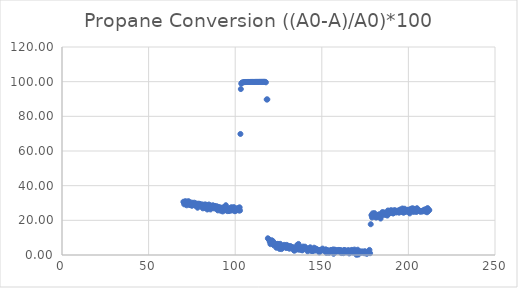
| Category | Propane Conversion |
|---|---|
| 70.10443 | 30.726 |
| 70.33783 | 30.317 |
| 70.57143 | 29.229 |
| 70.80475 | 29.984 |
| 71.03842 | 30.867 |
| 71.2719 | 30.944 |
| 71.50573 | 30.701 |
| 71.73882 | 30.279 |
| 71.97232 | 28.666 |
| 72.20607 | 30.048 |
| 72.43897 | 30.829 |
| 72.67272 | 30.611 |
| 72.90613 | 29.728 |
| 73.13953 | 31.008 |
| 73.37282 | 28.973 |
| 73.60572 | 29.869 |
| 73.83852 | 29.293 |
| 74.07172 | 28.82 |
| 74.30515 | 28.858 |
| 74.5381 | 29.383 |
| 74.77153 | 30.253 |
| 75.00547 | 28.385 |
| 75.23915 | 29.588 |
| 75.47242 | 28.896 |
| 75.70617 | 29.805 |
| 75.93913 | 29.447 |
| 76.17287 | 28.781 |
| 76.40602 | 30.189 |
| 76.63975 | 29.216 |
| 76.8728 | 28.653 |
| 77.10597 | 28.41 |
| 77.3393 | 28.845 |
| 77.57272 | 29.728 |
| 77.8061 | 28.346 |
| 78.04023 | 28.576 |
| 78.27362 | 27.271 |
| 78.507 | 29.05 |
| 78.74085 | 29.268 |
| 78.97373 | 29.613 |
| 79.2068 | 29.024 |
| 79.44078 | 28.896 |
| 79.67463 | 29.421 |
| 79.90855 | 28.794 |
| 80.14255 | 28.487 |
| 80.37617 | 28.372 |
| 80.60932 | 29.178 |
| 80.84238 | 27.834 |
| 81.07563 | 28.935 |
| 81.30957 | 26.926 |
| 81.54335 | 28.96 |
| 81.77735 | 27.348 |
| 82.01055 | 28.346 |
| 82.24422 | 27.553 |
| 82.47763 | 29.178 |
| 82.71093 | 27.028 |
| 82.9445 | 28.845 |
| 83.17827 | 29.024 |
| 83.41153 | 27.297 |
| 83.64458 | 27.399 |
| 83.87808 | 26.247 |
| 84.1111 | 27.502 |
| 84.3442 | 28.129 |
| 84.57725 | 27.476 |
| 84.81073 | 29.14 |
| 85.04437 | 28.487 |
| 85.27747 | 27.681 |
| 85.51065 | 28.218 |
| 85.74392 | 26.286 |
| 85.97798 | 28.487 |
| 86.21107 | 27.86 |
| 86.44472 | 27.22 |
| 86.67822 | 27.565 |
| 86.9118 | 27.847 |
| 87.14508 | 28.692 |
| 87.37818 | 28.116 |
| 87.6117 | 26.938 |
| 87.84517 | 28.103 |
| 88.07858 | 27.425 |
| 88.3121 | 28.321 |
| 88.54512 | 27.553 |
| 88.778 | 26.759 |
| 89.01232 | 27.425 |
| 89.24553 | 26.836 |
| 89.47897 | 28.103 |
| 89.71218 | 26.593 |
| 89.94548 | 25.723 |
| 90.17872 | 26.67 |
| 90.41182 | 27.54 |
| 90.6451 | 27.271 |
| 90.87867 | 27.591 |
| 91.11188 | 27.015 |
| 91.34527 | 26.926 |
| 91.57917 | 25.531 |
| 91.81258 | 26.337 |
| 92.0462 | 27.284 |
| 92.2795 | 27.028 |
| 92.51292 | 26.35 |
| 92.74605 | 25.121 |
| 92.97985 | 27.028 |
| 93.2133 | 27.297 |
| 93.44665 | 27.604 |
| 93.67993 | 25.646 |
| 93.91373 | 27.002 |
| 94.14687 | 26.452 |
| 94.38032 | 26.158 |
| 94.61382 | 28.717 |
| 94.84725 | 26.503 |
| 95.08082 | 25.787 |
| 95.31465 | 26.926 |
| 95.548 | 25.313 |
| 95.78165 | 26.273 |
| 96.01513 | 25.851 |
| 96.24843 | 26.874 |
| 96.48158 | 25.326 |
| 96.71508 | 26.759 |
| 96.94897 | 26.286 |
| 97.18222 | 25.659 |
| 97.41588 | 27.079 |
| 97.6493 | 26.465 |
| 97.88222 | 27.591 |
| 98.11532 | 25.697 |
| 98.34928 | 26.593 |
| 98.58245 | 27.079 |
| 98.8167 | 26.593 |
| 99.05005 | 25.953 |
| 99.28375 | 27.604 |
| 99.51673 | 26.606 |
| 99.75008 | 25.262 |
| 99.98415 | 26.721 |
| 100.21767 | 25.467 |
| 100.45092 | 25.851 |
| 100.68392 | 26.247 |
| 100.9175 | 26.772 |
| 101.15068 | 26.874 |
| 101.3838 | 26.311 |
| 101.61713 | 26.183 |
| 101.85043 | 26.887 |
| 102.08377 | 25.633 |
| 102.31717 | 27.233 |
| 102.55055 | 27.502 |
| 102.78502 | 25.646 |
| 103.01818 | 69.823 |
| 103.25142 | 95.726 |
| 103.49983 | 98.842 |
| 103.79445 | 99.358 |
| 104.22358 | 99.561 |
| 104.69098 | 99.652 |
| 105.16288 | 99.721 |
| 105.63787 | 99.755 |
| 106.11338 | 99.785 |
| 106.58812 | 99.801 |
| 107.06315 | 99.821 |
| 107.53862 | 99.829 |
| 108.01317 | 99.839 |
| 108.48808 | 99.844 |
| 108.963 | 99.852 |
| 109.43757 | 99.857 |
| 109.91243 | 99.862 |
| 110.38763 | 99.86 |
| 110.8626 | 99.871 |
| 111.33833 | 99.872 |
| 111.8131 | 99.874 |
| 112.26812 | 99.877 |
| 112.72325 | 99.886 |
| 113.17812 | 99.881 |
| 113.63292 | 99.889 |
| 114.088 | 99.894 |
| 114.54357 | 99.897 |
| 114.99885 | 99.899 |
| 115.4536 | 99.899 |
| 115.9084 | 99.902 |
| 116.36432 | 99.906 |
| 116.81925 | 99.907 |
| 117.27435 | 99.911 |
| 117.7298 | 99.627 |
| 118.18515 | 89.715 |
| 118.5634 | 89.765 |
| 118.85673 | 9.649 |
| 119.23293 | 9.226 |
| 119.60925 | 8.689 |
| 119.98587 | 7.55 |
| 120.36222 | 6.257 |
| 120.73823 | 7.051 |
| 121.11418 | 8.51 |
| 121.49 | 7.358 |
| 121.86578 | 7.896 |
| 122.24282 | 5.566 |
| 122.61865 | 6.846 |
| 122.99403 | 6.309 |
| 123.36987 | 6.27 |
| 123.74642 | 4.185 |
| 124.12227 | 6.091 |
| 124.4981 | 6.424 |
| 124.87392 | 6.347 |
| 125.25015 | 4.646 |
| 125.62642 | 3.493 |
| 126.00242 | 6.437 |
| 126.37822 | 5.195 |
| 126.75468 | 3.404 |
| 127.13077 | 4.786 |
| 127.50698 | 4.223 |
| 127.88268 | 4.914 |
| 128.25855 | 5.848 |
| 128.6352 | 4.735 |
| 129.01128 | 5.285 |
| 129.3877 | 4.031 |
| 129.76378 | 5.835 |
| 130.14007 | 4.646 |
| 130.51655 | 5.272 |
| 130.8921 | 4.07 |
| 131.26803 | 3.622 |
| 131.64387 | 5.003 |
| 132.02008 | 5.093 |
| 132.39577 | 4.376 |
| 132.77222 | 3.916 |
| 133.1483 | 4.569 |
| 133.52452 | 4.171 |
| 133.9004 | 2.649 |
| 134.27642 | 2.521 |
| 134.65242 | 3.302 |
| 135.02832 | 3.929 |
| 135.40415 | 3.135 |
| 135.77982 | 5.784 |
| 136.15595 | 3.903 |
| 136.53162 | 6.385 |
| 136.9074 | 3.033 |
| 137.28348 | 3.75 |
| 137.65892 | 4.453 |
| 138.0343 | 3.046 |
| 138.41025 | 2.956 |
| 138.78582 | 2.688 |
| 139.16163 | 4.875 |
| 139.53745 | 3.865 |
| 139.91345 | 3.455 |
| 140.2891 | 4.824 |
| 140.66532 | 3.929 |
| 141.04132 | 3.851 |
| 141.41797 | 3.711 |
| 141.79383 | 2.099 |
| 142.1696 | 3.455 |
| 142.54605 | 3.391 |
| 142.92193 | 3.762 |
| 143.29857 | 4.441 |
| 143.6745 | 2.418 |
| 144.05035 | 2.93 |
| 144.42592 | 2.342 |
| 144.80202 | 2.252 |
| 145.17833 | 2.61 |
| 145.5543 | 4.223 |
| 145.9305 | 3.148 |
| 146.30658 | 2.559 |
| 146.68282 | 3.672 |
| 147.05863 | 3.058 |
| 147.43462 | 3.008 |
| 147.81033 | 3.02 |
| 148.18655 | 2.444 |
| 148.56225 | 1.459 |
| 148.9383 | 2.623 |
| 149.31415 | 3.033 |
| 149.69053 | 2.879 |
| 150.06655 | 2.674 |
| 150.44202 | 3.686 |
| 150.81822 | 3.071 |
| 151.19387 | 2.559 |
| 151.57028 | 2.764 |
| 151.946 | 2.099 |
| 152.32193 | 3.276 |
| 152.69752 | 1.177 |
| 153.07332 | 1.919 |
| 153.44895 | 2.7 |
| 153.8248 | 2.559 |
| 154.20082 | 1.241 |
| 154.5747 | 1.881 |
| 154.95062 | 2.418 |
| 155.32658 | 2.956 |
| 155.7006 | 2.547 |
| 156.0765 | 2.393 |
| 156.45248 | 3.187 |
| 156.82835 | 0.69 |
| 157.20442 | 3.02 |
| 157.58017 | 3.046 |
| 157.95588 | 2.406 |
| 158.33193 | 1.779 |
| 158.7078 | 2.777 |
| 159.08413 | 2.649 |
| 159.46 | 2.252 |
| 159.83647 | 2.93 |
| 160.21287 | 2.738 |
| 160.58893 | 1.549 |
| 160.96472 | 2.853 |
| 161.34073 | 1.126 |
| 161.71647 | 1.356 |
| 162.09248 | 1.766 |
| 162.46827 | 1.062 |
| 162.84482 | 2.905 |
| 163.22067 | 2.265 |
| 163.59695 | 2.751 |
| 163.9728 | 1.485 |
| 164.34948 | 2.278 |
| 164.72608 | 1.664 |
| 165.10205 | 2.636 |
| 165.47847 | 2.764 |
| 165.85495 | 0.895 |
| 166.23057 | 1.203 |
| 166.60633 | 2.393 |
| 166.98273 | 2.521 |
| 167.35893 | 2.956 |
| 167.73533 | 1.523 |
| 168.11092 | 1.497 |
| 168.48697 | 1.638 |
| 168.86297 | 3.123 |
| 169.23627 | 2.483 |
| 169.61213 | 1.561 |
| 169.98802 | 0.128 |
| 170.36388 | 1.855 |
| 170.74015 | 3.046 |
| 171.11655 | 0.256 |
| 171.4929 | 1.907 |
| 171.86948 | 2.048 |
| 172.2455 | 1.676 |
| 172.62123 | 1.932 |
| 172.99693 | 1.254 |
| 173.37335 | 2.034 |
| 173.7497 | 1.869 |
| 174.12627 | 1.612 |
| 174.50198 | 1.036 |
| 174.87772 | 2.189 |
| 175.2542 | 1.523 |
| 175.62998 | 1.753 |
| 176.00585 | 0.666 |
| 176.38158 | 1.229 |
| 176.75732 | 1.535 |
| 177.13358 | 1.587 |
| 177.50968 | 2.93 |
| 177.88572 | 1.036 |
| 178.26172 | 17.75 |
| 178.63747 | 22.997 |
| 179.00653 | 21.64 |
| 179.37502 | 24.059 |
| 179.74408 | 22.728 |
| 180.07458 | 22.626 |
| 180.39767 | 24.174 |
| 180.72035 | 22.101 |
| 181.04332 | 22.664 |
| 181.36635 | 21.589 |
| 181.68962 | 22.293 |
| 182.01295 | 22.882 |
| 182.33577 | 21.935 |
| 182.65882 | 23.24 |
| 182.98177 | 23.138 |
| 183.30532 | 23.457 |
| 183.62878 | 21.998 |
| 183.95255 | 21.026 |
| 184.276 | 23.15 |
| 184.5991 | 22.715 |
| 184.92267 | 24.724 |
| 185.24583 | 23.432 |
| 185.56858 | 24.596 |
| 185.89178 | 24.212 |
| 186.21477 | 24.353 |
| 186.53772 | 23.15 |
| 186.86073 | 23.381 |
| 187.1836 | 24.085 |
| 187.50655 | 23.931 |
| 187.82955 | 22.754 |
| 188.15297 | 25.671 |
| 188.47678 | 23.701 |
| 188.79933 | 24.072 |
| 189.12258 | 25.531 |
| 189.44613 | 24.2 |
| 189.76948 | 25.505 |
| 190.09237 | 25.851 |
| 190.41568 | 24.737 |
| 190.73895 | 25.428 |
| 191.06172 | 23.982 |
| 191.38497 | 24.097 |
| 191.70833 | 25.211 |
| 192.03155 | 25.927 |
| 192.35437 | 25.326 |
| 192.6776 | 24.584 |
| 193.00122 | 25.505 |
| 193.32442 | 24.648 |
| 193.64788 | 24.827 |
| 193.971 | 24.993 |
| 194.29405 | 25.748 |
| 194.6169 | 24.417 |
| 194.94002 | 25.415 |
| 195.26263 | 26.235 |
| 195.58588 | 26.132 |
| 195.90975 | 25.262 |
| 196.23283 | 24.891 |
| 196.55538 | 26.823 |
| 196.87878 | 24.75 |
| 197.20212 | 24.366 |
| 197.52523 | 25.428 |
| 197.84815 | 26.682 |
| 198.1721 | 25.134 |
| 198.49497 | 24.865 |
| 198.81797 | 25.825 |
| 199.14047 | 25.774 |
| 199.4639 | 25.671 |
| 199.78745 | 26.132 |
| 200.11098 | 24.891 |
| 200.43433 | 25.671 |
| 200.7575 | 23.995 |
| 201.08095 | 25.787 |
| 201.40455 | 26.644 |
| 201.72742 | 25.799 |
| 202.05032 | 25.543 |
| 202.3737 | 26.99 |
| 202.69647 | 25.569 |
| 203.01933 | 24.84 |
| 203.34252 | 26.606 |
| 203.66528 | 25.787 |
| 203.9882 | 25.224 |
| 204.31175 | 25.39 |
| 204.63472 | 24.814 |
| 204.95835 | 26.99 |
| 205.28135 | 25.889 |
| 205.60465 | 25.979 |
| 205.9278 | 25.876 |
| 206.25107 | 25.39 |
| 206.57395 | 25.172 |
| 206.89677 | 25.019 |
| 207.21952 | 25.467 |
| 207.5424 | 25.07 |
| 207.86547 | 25.262 |
| 208.18907 | 25.326 |
| 208.5119 | 25.236 |
| 208.83535 | 25.927 |
| 209.15867 | 25.927 |
| 209.48188 | 26.298 |
| 209.80497 | 25.07 |
| 210.12793 | 26.324 |
| 210.45117 | 25.147 |
| 210.77428 | 24.648 |
| 211.09728 | 27.079 |
| 211.42075 | 25.326 |
| 211.74392 | 26.043 |
| 212.06742 | 25.876 |